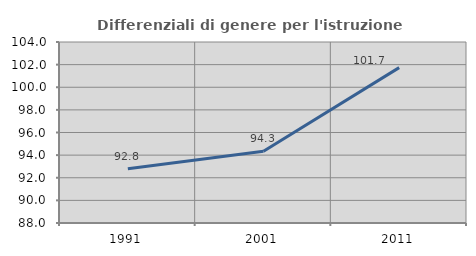
| Category | Differenziali di genere per l'istruzione superiore |
|---|---|
| 1991.0 | 92.804 |
| 2001.0 | 94.344 |
| 2011.0 | 101.736 |